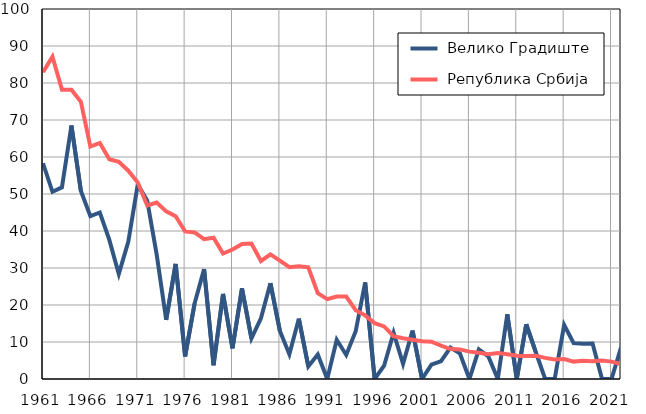
| Category |  Велико Градиште |  Република Србија |
|---|---|---|
| 1961.0 | 58.3 | 82.9 |
| 1962.0 | 50.6 | 87.1 |
| 1963.0 | 51.8 | 78.2 |
| 1964.0 | 68.5 | 78.2 |
| 1965.0 | 50.8 | 74.9 |
| 1966.0 | 44 | 62.8 |
| 1967.0 | 45 | 63.8 |
| 1968.0 | 37.6 | 59.4 |
| 1969.0 | 28.4 | 58.7 |
| 1970.0 | 37.1 | 56.3 |
| 1971.0 | 52.6 | 53.1 |
| 1972.0 | 48.2 | 46.9 |
| 1973.0 | 33.6 | 47.7 |
| 1974.0 | 16 | 45.3 |
| 1975.0 | 31.1 | 44 |
| 1976.0 | 6.1 | 39.9 |
| 1977.0 | 20.4 | 39.6 |
| 1978.0 | 29.7 | 37.8 |
| 1979.0 | 3.7 | 38.2 |
| 1980.0 | 23 | 33.9 |
| 1981.0 | 8.3 | 35 |
| 1982.0 | 24.5 | 36.5 |
| 1983.0 | 11 | 36.6 |
| 1984.0 | 16.4 | 31.9 |
| 1985.0 | 25.9 | 33.7 |
| 1986.0 | 13 | 32 |
| 1987.0 | 6.7 | 30.2 |
| 1988.0 | 16.3 | 30.5 |
| 1989.0 | 3.4 | 30.2 |
| 1990.0 | 6.6 | 23.2 |
| 1991.0 | 0 | 21.6 |
| 1992.0 | 10.6 | 22.3 |
| 1993.0 | 6.5 | 22.3 |
| 1994.0 | 12.9 | 18.6 |
| 1995.0 | 26.1 | 17.2 |
| 1996.0 | 0 | 15.1 |
| 1997.0 | 3.6 | 14.2 |
| 1998.0 | 12.5 | 11.6 |
| 1999.0 | 4.1 | 11 |
| 2000.0 | 13.1 | 10.6 |
| 2001.0 | 0 | 10.2 |
| 2002.0 | 3.9 | 10.1 |
| 2003.0 | 4.8 | 9 |
| 2004.0 | 8.5 | 8.1 |
| 2005.0 | 6.9 | 8 |
| 2006.0 | 0 | 7.4 |
| 2007.0 | 8 | 7.1 |
| 2008.0 | 6.1 | 6.7 |
| 2009.0 | 0 | 7 |
| 2010.0 | 17.5 | 6.7 |
| 2011.0 | 0 | 6.3 |
| 2012.0 | 14.8 | 6.2 |
| 2013.0 | 7.3 | 6.3 |
| 2014.0 | 0 | 5.7 |
| 2015.0 | 0 | 5.3 |
| 2016.0 | 14.6 | 5.4 |
| 2017.0 | 9.7 | 4.7 |
| 2018.0 | 9.5 | 4.9 |
| 2019.0 | 9.6 | 4.8 |
| 2020.0 | 0 | 5 |
| 2021.0 | 0 | 4.7 |
| 2022.0 | 8.5 | 4 |